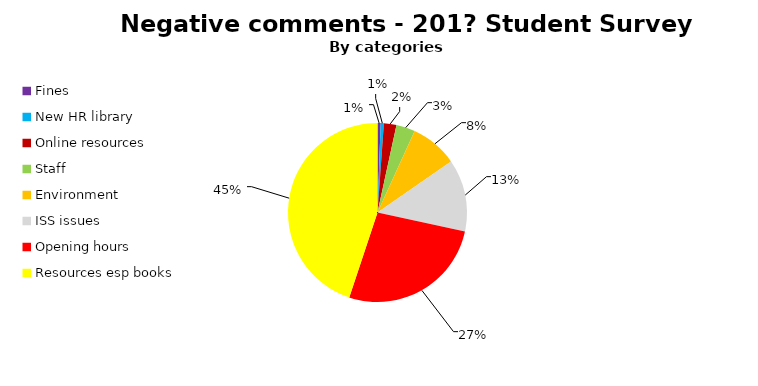
| Category | Series 0 |
|---|---|
| Fines  | 1 |
| New HR library | 1 |
| Online resources  | 4 |
| Staff  | 6 |
| Environment  | 15 |
| ISS issues | 23 |
| Opening hours | 47 |
| Resources esp books  | 79 |